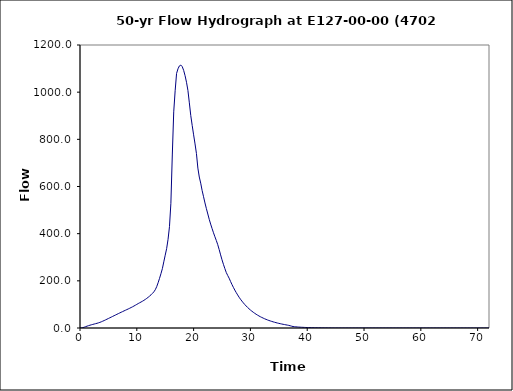
| Category | Series 0 |
|---|---|
| 0.0 | 0 |
| 0.25 | 0.3 |
| 0.5 | 1.5 |
| 0.75 | 3.5 |
| 1.0 | 5.7 |
| 1.25 | 7.9 |
| 1.5 | 9.9 |
| 1.75 | 11.8 |
| 2.0 | 13.6 |
| 2.25 | 15.2 |
| 2.5 | 16.8 |
| 2.75 | 18.4 |
| 3.0 | 20 |
| 3.25 | 21.8 |
| 3.5 | 23.9 |
| 3.75 | 26.3 |
| 4.0 | 28.9 |
| 4.25 | 31.6 |
| 4.5 | 34.5 |
| 4.75 | 37.4 |
| 5.0 | 40.3 |
| 5.25 | 43.3 |
| 5.5 | 46.2 |
| 5.75 | 49.2 |
| 6.0 | 52.2 |
| 6.25 | 55.1 |
| 6.5 | 58.1 |
| 6.75 | 61 |
| 7.0 | 63.9 |
| 7.25 | 66.8 |
| 7.5 | 69.6 |
| 7.75 | 72.5 |
| 8.0 | 75.3 |
| 8.25 | 78.1 |
| 8.5 | 80.9 |
| 8.75 | 83.8 |
| 9.0 | 86.8 |
| 9.25 | 89.9 |
| 9.5 | 93.2 |
| 9.75 | 96.6 |
| 10.0 | 100.1 |
| 10.25 | 103.7 |
| 10.5 | 107 |
| 10.75 | 110.3 |
| 11.0 | 113.6 |
| 11.25 | 117.3 |
| 11.5 | 121.3 |
| 11.75 | 125.5 |
| 12.0 | 130.2 |
| 12.25 | 135.2 |
| 12.5 | 140.7 |
| 12.75 | 146.7 |
| 13.0 | 153.3 |
| 13.25 | 162.2 |
| 13.5 | 175.2 |
| 13.75 | 191.7 |
| 14.0 | 210.4 |
| 14.25 | 230.2 |
| 14.5 | 251.6 |
| 14.75 | 280.4 |
| 15.0 | 308.7 |
| 15.25 | 336.5 |
| 15.5 | 375.9 |
| 15.75 | 429.8 |
| 16.0 | 528.9 |
| 16.25 | 733.6 |
| 16.5 | 916.5 |
| 16.75 | 1006 |
| 17.0 | 1079.4 |
| 17.25 | 1099.1 |
| 17.5 | 1111.5 |
| 17.75 | 1114.9 |
| 18.0 | 1108.1 |
| 18.25 | 1092.3 |
| 18.5 | 1069.7 |
| 18.75 | 1041.9 |
| 19.0 | 1007.2 |
| 19.25 | 954.6 |
| 19.5 | 900.7 |
| 19.75 | 858.9 |
| 20.0 | 819.1 |
| 20.25 | 780.5 |
| 20.5 | 739.7 |
| 20.75 | 678.1 |
| 21.0 | 640.2 |
| 21.25 | 614.2 |
| 21.5 | 582.9 |
| 21.75 | 556.6 |
| 22.0 | 530.2 |
| 22.25 | 506 |
| 22.5 | 483.3 |
| 22.75 | 460.9 |
| 23.0 | 440.5 |
| 23.25 | 421.9 |
| 23.5 | 403.8 |
| 23.75 | 386.8 |
| 24.0 | 370.7 |
| 24.25 | 353.2 |
| 24.5 | 332.4 |
| 24.75 | 310.2 |
| 25.0 | 289.2 |
| 25.25 | 270 |
| 25.5 | 252 |
| 25.75 | 235.3 |
| 26.0 | 222.7 |
| 26.25 | 211.3 |
| 26.5 | 197.5 |
| 26.75 | 184.4 |
| 27.0 | 172.3 |
| 27.25 | 160.9 |
| 27.5 | 150.3 |
| 27.75 | 140.3 |
| 28.0 | 130.7 |
| 28.25 | 122.1 |
| 28.5 | 114.1 |
| 28.75 | 106.7 |
| 29.0 | 99.7 |
| 29.25 | 93.3 |
| 29.5 | 87.2 |
| 29.75 | 81.6 |
| 30.0 | 76.3 |
| 30.25 | 71.4 |
| 30.5 | 66.8 |
| 30.75 | 62.5 |
| 31.0 | 58.4 |
| 31.25 | 54.7 |
| 31.5 | 51.1 |
| 31.75 | 47.8 |
| 32.0 | 44.8 |
| 32.25 | 41.9 |
| 32.5 | 39.2 |
| 32.75 | 36.6 |
| 33.0 | 34.2 |
| 33.25 | 32 |
| 33.5 | 29.9 |
| 33.75 | 28 |
| 34.0 | 26.1 |
| 34.25 | 24.4 |
| 34.5 | 22.7 |
| 34.75 | 21.1 |
| 35.0 | 19.7 |
| 35.25 | 18.3 |
| 35.5 | 17 |
| 35.75 | 15.7 |
| 36.0 | 14.6 |
| 36.25 | 13.4 |
| 36.5 | 12.3 |
| 36.75 | 11.1 |
| 37.0 | 9.5 |
| 37.25 | 7.7 |
| 37.5 | 6.2 |
| 37.75 | 5.5 |
| 38.0 | 4.9 |
| 38.25 | 4.4 |
| 38.5 | 3.9 |
| 38.75 | 3.5 |
| 39.0 | 3.1 |
| 39.25 | 2.8 |
| 39.5 | 2.5 |
| 39.75 | 2.2 |
| 40.0 | 2 |
| 40.25 | 1.8 |
| 40.5 | 1.6 |
| 40.75 | 1.4 |
| 41.0 | 1.3 |
| 41.25 | 1.1 |
| 41.5 | 1 |
| 41.75 | 0.9 |
| 42.0 | 0.8 |
| 42.25 | 0.7 |
| 42.5 | 0.6 |
| 42.75 | 0.5 |
| 43.0 | 0.4 |
| 43.25 | 0.4 |
| 43.5 | 0.3 |
| 43.75 | 0.2 |
| 44.0 | 0.2 |
| 44.25 | 0.1 |
| 44.5 | 0.1 |
| 44.75 | 0 |
| 45.0 | 0 |
| 45.25 | 0 |
| 45.5 | 0 |
| 45.75 | 0 |
| 46.0 | 0 |
| 46.25 | 0 |
| 46.5 | 0 |
| 46.75 | 0 |
| 47.0 | 0 |
| 47.25 | 0 |
| 47.5 | 0 |
| 47.75 | 0 |
| 48.0 | 0 |
| 48.25 | 0 |
| 48.5 | 0 |
| 48.75 | 0 |
| 49.0 | 0 |
| 49.25 | 0 |
| 49.5 | 0 |
| 49.75 | 0 |
| 50.0 | 0 |
| 50.25 | 0 |
| 50.5 | 0 |
| 50.75 | 0 |
| 51.0 | 0 |
| 51.25 | 0 |
| 51.5 | 0 |
| 51.75 | 0 |
| 52.0 | 0 |
| 52.25 | 0 |
| 52.5 | 0 |
| 52.75 | 0 |
| 53.0 | 0 |
| 53.25 | 0 |
| 53.5 | 0 |
| 53.75 | 0 |
| 54.0 | 0 |
| 54.25 | 0 |
| 54.5 | 0 |
| 54.75 | 0 |
| 55.0 | 0 |
| 55.25 | 0 |
| 55.5 | 0 |
| 55.75 | 0 |
| 56.0 | 0 |
| 56.25 | 0 |
| 56.5 | 0 |
| 56.75 | 0 |
| 57.0 | 0 |
| 57.25 | 0 |
| 57.5 | 0 |
| 57.75 | 0 |
| 58.0 | 0 |
| 58.25 | 0 |
| 58.5 | 0 |
| 58.75 | 0 |
| 59.0 | 0 |
| 59.25 | 0 |
| 59.5 | 0 |
| 59.75 | 0 |
| 60.0 | 0 |
| 60.25 | 0 |
| 60.5 | 0 |
| 60.75 | 0 |
| 61.0 | 0 |
| 61.25 | 0 |
| 61.5 | 0 |
| 61.75 | 0 |
| 62.0 | 0 |
| 62.25 | 0 |
| 62.5 | 0 |
| 62.75 | 0 |
| 63.0 | 0 |
| 63.25 | 0 |
| 63.5 | 0 |
| 63.75 | 0 |
| 64.0 | 0 |
| 64.25 | 0 |
| 64.5 | 0 |
| 64.75 | 0 |
| 65.0 | 0 |
| 65.25 | 0 |
| 65.5 | 0 |
| 65.75 | 0 |
| 66.0 | 0 |
| 66.25 | 0 |
| 66.5 | 0 |
| 66.75 | 0 |
| 67.0 | 0 |
| 67.25 | 0 |
| 67.5 | 0 |
| 67.75 | 0 |
| 68.0 | 0 |
| 68.25 | 0 |
| 68.5 | 0 |
| 68.75 | 0 |
| 69.0 | 0 |
| 69.25 | 0 |
| 69.5 | 0 |
| 69.75 | 0 |
| 70.0 | 0 |
| 70.25 | 0 |
| 70.5 | 0 |
| 70.75 | 0 |
| 71.0 | 0 |
| 71.25 | 0 |
| 71.5 | 0 |
| 71.75 | 0 |
| 72.0 | 0 |
| 72.25 | 0 |
| 72.5 | 0 |
| 72.75 | 0 |
| 73.0 | 0 |
| 73.25 | 0 |
| 73.5 | 0 |
| 73.75 | 0 |
| 74.0 | 0 |
| 74.25 | 0 |
| 74.5 | 0 |
| 74.75 | 0 |
| 75.0 | 0 |
| 75.25 | 0 |
| 75.5 | 0 |
| 75.75 | 0 |
| 76.0 | 0 |
| 76.25 | 0 |
| 76.5 | 0 |
| 76.75 | 0 |
| 77.0 | 0 |
| 77.25 | 0 |
| 77.5 | 0 |
| 77.75 | 0 |
| 78.0 | 0 |
| 78.25 | 0 |
| 78.5 | 0 |
| 78.75 | 0 |
| 79.0 | 0 |
| 79.25 | 0 |
| 79.5 | 0 |
| 79.75 | 0 |
| 80.0 | 0 |
| 80.25 | 0 |
| 80.5 | 0 |
| 80.75 | 0 |
| 81.0 | 0 |
| 81.25 | 0 |
| 81.5 | 0 |
| 81.75 | 0 |
| 82.0 | 0 |
| 82.25 | 0 |
| 82.5 | 0 |
| 82.75 | 0 |
| 83.0 | 0 |
| 83.25 | 0 |
| 83.5 | 0 |
| 83.75 | 0 |
| 84.0 | 0 |
| 84.25 | 0 |
| 84.5 | 0 |
| 84.75 | 0 |
| 85.0 | 0 |
| 85.25 | 0 |
| 85.5 | 0 |
| 85.75 | 0 |
| 86.0 | 0 |
| 86.25 | 0 |
| 86.5 | 0 |
| 86.75 | 0 |
| 87.0 | 0 |
| 87.25 | 0 |
| 87.5 | 0 |
| 87.75 | 0 |
| 88.0 | 0 |
| 88.25 | 0 |
| 88.5 | 0 |
| 88.75 | 0 |
| 89.0 | 0 |
| 89.25 | 0 |
| 89.5 | 0 |
| 89.75 | 0 |
| 90.0 | 0 |
| 90.25 | 0 |
| 90.5 | 0 |
| 90.75 | 0 |
| 91.0 | 0 |
| 91.25 | 0 |
| 91.5 | 0 |
| 91.75 | 0 |
| 92.0 | 0 |
| 92.25 | 0 |
| 92.5 | 0 |
| 92.75 | 0 |
| 93.0 | 0 |
| 93.25 | 0 |
| 93.5 | 0 |
| 93.75 | 0 |
| 94.0 | 0 |
| 94.25 | 0 |
| 94.5 | 0 |
| 94.75 | 0 |
| 95.0 | 0 |
| 95.25 | 0 |
| 95.5 | 0 |
| 95.75 | 0 |
| 96.0 | 0 |
| 96.25 | 0 |
| 96.5 | 0 |
| 96.75 | 0 |
| 97.0 | 0 |
| 97.25 | 0 |
| 97.5 | 0 |
| 97.75 | 0 |
| 98.0 | 0 |
| 98.25 | 0 |
| 98.5 | 0 |
| 98.75 | 0 |
| 99.0 | 0 |
| 99.25 | 0 |
| 99.5 | 0 |
| 99.75 | 0 |
| 100.0 | 0 |
| 100.25 | 0 |
| 100.5 | 0 |
| 100.75 | 0 |
| 101.0 | 0 |
| 101.25 | 0 |
| 101.5 | 0 |
| 101.75 | 0 |
| 102.0 | 0 |
| 102.25 | 0 |
| 102.5 | 0 |
| 102.75 | 0 |
| 103.0 | 0 |
| 103.25 | 0 |
| 103.5 | 0 |
| 103.75 | 0 |
| 104.0 | 0 |
| 104.25 | 0 |
| 104.5 | 0 |
| 104.75 | 0 |
| 105.0 | 0 |
| 105.25 | 0 |
| 105.5 | 0 |
| 105.75 | 0 |
| 106.0 | 0 |
| 106.25 | 0 |
| 106.5 | 0 |
| 106.75 | 0 |
| 107.0 | 0 |
| 107.25 | 0 |
| 107.5 | 0 |
| 107.75 | 0 |
| 108.0 | 0 |
| 108.25 | 0 |
| 108.5 | 0 |
| 108.75 | 0 |
| 109.0 | 0 |
| 109.25 | 0 |
| 109.5 | 0 |
| 109.75 | 0 |
| 110.0 | 0 |
| 110.25 | 0 |
| 110.5 | 0 |
| 110.75 | 0 |
| 111.0 | 0 |
| 111.25 | 0 |
| 111.5 | 0 |
| 111.75 | 0 |
| 112.0 | 0 |
| 112.25 | 0 |
| 112.5 | 0 |
| 112.75 | 0 |
| 113.0 | 0 |
| 113.25 | 0 |
| 113.5 | 0 |
| 113.75 | 0 |
| 114.0 | 0 |
| 114.25 | 0 |
| 114.5 | 0 |
| 114.75 | 0 |
| 115.0 | 0 |
| 115.25 | 0 |
| 115.5 | 0 |
| 115.75 | 0 |
| 116.0 | 0 |
| 116.25 | 0 |
| 116.5 | 0 |
| 116.75 | 0 |
| 117.0 | 0 |
| 117.25 | 0 |
| 117.5 | 0 |
| 117.75 | 0 |
| 118.0 | 0 |
| 118.25 | 0 |
| 118.5 | 0 |
| 118.75 | 0 |
| 119.0 | 0 |
| 119.25 | 0 |
| 119.5 | 0 |
| 119.75 | 0 |
| 120.0 | 0 |
| 120.25 | 0 |
| 120.5 | 0 |
| 120.75 | 0 |
| 121.0 | 0 |
| 121.25 | 0 |
| 121.5 | 0 |
| 121.75 | 0 |
| 122.0 | 0 |
| 122.25 | 0 |
| 122.5 | 0 |
| 122.75 | 0 |
| 123.0 | 0 |
| 123.25 | 0 |
| 123.5 | 0 |
| 123.75 | 0 |
| 124.0 | 0 |
| 124.25 | 0 |
| 124.5 | 0 |
| 124.75 | 0 |
| 125.0 | 0 |
| 125.25 | 0 |
| 125.5 | 0 |
| 125.75 | 0 |
| 126.0 | 0 |
| 126.25 | 0 |
| 126.5 | 0 |
| 126.75 | 0 |
| 127.0 | 0 |
| 127.25 | 0 |
| 127.5 | 0 |
| 127.75 | 0 |
| 128.0 | 0 |
| 128.25 | 0 |
| 128.5 | 0 |
| 128.75 | 0 |
| 129.0 | 0 |
| 129.25 | 0 |
| 129.5 | 0 |
| 129.75 | 0 |
| 130.0 | 0 |
| 130.25 | 0 |
| 130.5 | 0 |
| 130.75 | 0 |
| 131.0 | 0 |
| 131.25 | 0 |
| 131.5 | 0 |
| 131.75 | 0 |
| 132.0 | 0 |
| 132.25 | 0 |
| 132.5 | 0 |
| 132.75 | 0 |
| 133.0 | 0 |
| 133.25 | 0 |
| 133.5 | 0 |
| 133.75 | 0 |
| 134.0 | 0 |
| 134.25 | 0 |
| 134.5 | 0 |
| 134.75 | 0 |
| 135.0 | 0 |
| 135.25 | 0 |
| 135.5 | 0 |
| 135.75 | 0 |
| 136.0 | 0 |
| 136.25 | 0 |
| 136.5 | 0 |
| 136.75 | 0 |
| 137.0 | 0 |
| 137.25 | 0 |
| 137.5 | 0 |
| 137.75 | 0 |
| 138.0 | 0 |
| 138.25 | 0 |
| 138.5 | 0 |
| 138.75 | 0 |
| 139.0 | 0 |
| 139.25 | 0 |
| 139.5 | 0 |
| 139.75 | 0 |
| 140.0 | 0 |
| 140.25 | 0 |
| 140.5 | 0 |
| 140.75 | 0 |
| 141.0 | 0 |
| 141.25 | 0 |
| 141.5 | 0 |
| 141.75 | 0 |
| 142.0 | 0 |
| 142.25 | 0 |
| 142.5 | 0 |
| 142.75 | 0 |
| 143.0 | 0 |
| 143.25 | 0 |
| 143.5 | 0 |
| 143.75 | 0 |
| 144.0 | 0 |
| 144.25 | 0 |
| 144.5 | 0 |
| 144.75 | 0 |
| 145.0 | 0 |
| 145.25 | 0 |
| 145.5 | 0 |
| 145.75 | 0 |
| 146.0 | 0 |
| 146.25 | 0 |
| 146.5 | 0 |
| 146.75 | 0 |
| 147.0 | 0 |
| 147.25 | 0 |
| 147.5 | 0 |
| 147.75 | 0 |
| 148.0 | 0 |
| 148.25 | 0 |
| 148.5 | 0 |
| 148.75 | 0 |
| 149.0 | 0 |
| 149.25 | 0 |
| 149.5 | 0 |
| 149.75 | 0 |
| 150.0 | 0 |
| 150.25 | 0 |
| 150.5 | 0 |
| 150.75 | 0 |
| 151.0 | 0 |
| 151.25 | 0 |
| 151.5 | 0 |
| 151.75 | 0 |
| 152.0 | 0 |
| 152.25 | 0 |
| 152.5 | 0 |
| 152.75 | 0 |
| 153.0 | 0 |
| 153.25 | 0 |
| 153.5 | 0 |
| 153.75 | 0 |
| 154.0 | 0 |
| 154.25 | 0 |
| 154.5 | 0 |
| 154.75 | 0 |
| 155.0 | 0 |
| 155.25 | 0 |
| 155.5 | 0 |
| 155.75 | 0 |
| 156.0 | 0 |
| 156.25 | 0 |
| 156.5 | 0 |
| 156.75 | 0 |
| 157.0 | 0 |
| 157.25 | 0 |
| 157.5 | 0 |
| 157.75 | 0 |
| 158.0 | 0 |
| 158.25 | 0 |
| 158.5 | 0 |
| 158.75 | 0 |
| 159.0 | 0 |
| 159.25 | 0 |
| 159.5 | 0 |
| 159.75 | 0 |
| 160.0 | 0 |
| 160.25 | 0 |
| 160.5 | 0 |
| 160.75 | 0 |
| 161.0 | 0 |
| 161.25 | 0 |
| 161.5 | 0 |
| 161.75 | 0 |
| 162.0 | 0 |
| 162.25 | 0 |
| 162.5 | 0 |
| 162.75 | 0 |
| 163.0 | 0 |
| 163.25 | 0 |
| 163.5 | 0 |
| 163.75 | 0 |
| 164.0 | 0 |
| 164.25 | 0 |
| 164.5 | 0 |
| 164.75 | 0 |
| 165.0 | 0 |
| 165.25 | 0 |
| 165.5 | 0 |
| 165.75 | 0 |
| 166.0 | 0 |
| 166.25 | 0 |
| 166.5 | 0 |
| 166.75 | 0 |
| 167.0 | 0 |
| 167.25 | 0 |
| 167.5 | 0 |
| 167.75 | 0 |
| 168.0 | 0 |
| 168.25 | 0 |
| 168.5 | 0 |
| 168.75 | 0 |
| 169.0 | 0 |
| 169.25 | 0 |
| 169.5 | 0 |
| 169.75 | 0 |
| 170.0 | 0 |
| 170.25 | 0 |
| 170.5 | 0 |
| 170.75 | 0 |
| 171.0 | 0 |
| 171.25 | 0 |
| 171.5 | 0 |
| 171.75 | 0 |
| 172.0 | 0 |
| 172.25 | 0 |
| 172.5 | 0 |
| 172.75 | 0 |
| 173.0 | 0 |
| 173.25 | 0 |
| 173.5 | 0 |
| 173.75 | 0 |
| 174.0 | 0 |
| 174.25 | 0 |
| 174.5 | 0 |
| 174.75 | 0 |
| 175.0 | 0 |
| 175.25 | 0 |
| 175.5 | 0 |
| 175.75 | 0 |
| 176.0 | 0 |
| 176.25 | 0 |
| 176.5 | 0 |
| 176.75 | 0 |
| 177.0 | 0 |
| 177.25 | 0 |
| 177.5 | 0 |
| 177.75 | 0 |
| 178.0 | 0 |
| 178.25 | 0 |
| 178.5 | 0 |
| 178.75 | 0 |
| 179.0 | 0 |
| 179.25 | 0 |
| 179.5 | 0 |
| 179.75 | 0 |
| 180.0 | 0 |
| 180.25 | 0 |
| 180.5 | 0 |
| 180.75 | 0 |
| 181.0 | 0 |
| 181.25 | 0 |
| 181.5 | 0 |
| 181.75 | 0 |
| 182.0 | 0 |
| 182.25 | 0 |
| 182.5 | 0 |
| 182.75 | 0 |
| 183.0 | 0 |
| 183.25 | 0 |
| 183.5 | 0 |
| 183.75 | 0 |
| 184.0 | 0 |
| 184.25 | 0 |
| 184.5 | 0 |
| 184.75 | 0 |
| 185.0 | 0 |
| 185.25 | 0 |
| 185.5 | 0 |
| 185.75 | 0 |
| 186.0 | 0 |
| 186.25 | 0 |
| 186.5 | 0 |
| 186.75 | 0 |
| 187.0 | 0 |
| 187.25 | 0 |
| 187.5 | 0 |
| 187.75 | 0 |
| 188.0 | 0 |
| 188.25 | 0 |
| 188.5 | 0 |
| 188.75 | 0 |
| 189.0 | 0 |
| 189.25 | 0 |
| 189.5 | 0 |
| 189.75 | 0 |
| 190.0 | 0 |
| 190.25 | 0 |
| 190.5 | 0 |
| 190.75 | 0 |
| 191.0 | 0 |
| 191.25 | 0 |
| 191.5 | 0 |
| 191.75 | 0 |